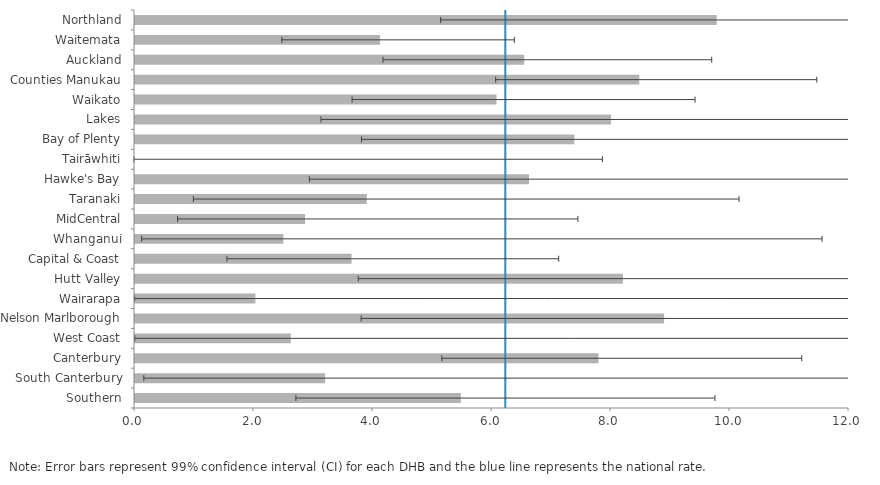
| Category | DHB |
|---|---|
| Northland | 9.777 |
| Waitemata | 4.119 |
| Auckland | 6.542 |
| Counties Manukau | 8.476 |
| Waikato | 6.076 |
| Lakes | 8 |
| Bay of Plenty | 7.386 |
| Tairāwhiti | 0 |
| Hawke's Bay | 6.623 |
| Taranaki | 3.896 |
| MidCentral | 2.859 |
| Whanganui | 2.494 |
| Capital & Coast | 3.639 |
| Hutt Valley | 8.201 |
| Wairarapa | 2.024 |
| Nelson Marlborough | 8.892 |
| West Coast | 2.618 |
| Canterbury | 7.789 |
| South Canterbury | 3.195 |
| Southern | 5.476 |